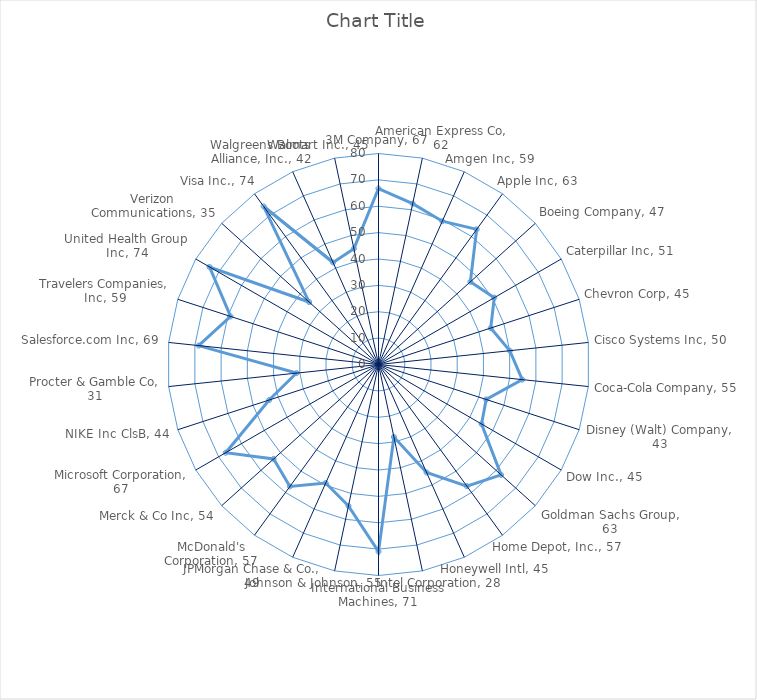
| Category | Series 0 |
|---|---|
| 3M Company, 67 | 66.724 |
| American Express Co, 62 | 62.34 |
| Amgen Inc, 59 | 59.468 |
| Apple Inc, 63 | 63.314 |
| Boeing Company, 47 | 46.866 |
| Caterpillar Inc, 51 | 50.693 |
| Chevron Corp, 45 | 44.743 |
| Cisco Systems Inc, 50 | 50.059 |
| Coca-Cola Company, 55 | 54.804 |
| Disney (Walt) Company, 43 | 42.925 |
| Dow Inc., 45 | 45.117 |
| Goldman Sachs Group, 63 | 62.539 |
| Home Depot, Inc., 57 | 56.999 |
| Honeywell Intl, 45 | 44.791 |
| Intel Corporation, 28 | 28.099 |
| International Business Machines, 71 | 70.94 |
| Johnson & Johnson, 55 | 54.814 |
| JPMorgan Chase & Co., 49 | 49.206 |
| McDonald's Corporation, 57 | 57.179 |
| Merck & Co Inc, 54 | 53.502 |
| Microsoft Corporation, 67 | 66.893 |
| NIKE Inc ClsB, 44 | 43.595 |
| Procter & Gamble Co, 31 | 31.258 |
| Salesforce.com Inc, 69 | 68.571 |
| Travelers Companies, Inc, 59 | 58.966 |
| United Health Group Inc, 74 | 73.959 |
| Verizon Communications, 35 | 35.404 |
| Visa Inc., 74 | 74.108 |
| Walgreens Boots Alliance, Inc., 42 | 42.332 |
| Walmart Inc., 45 | 44.898 |